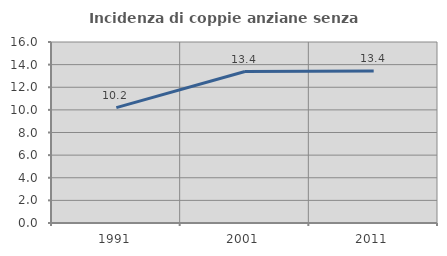
| Category | Incidenza di coppie anziane senza figli  |
|---|---|
| 1991.0 | 10.194 |
| 2001.0 | 13.386 |
| 2011.0 | 13.444 |